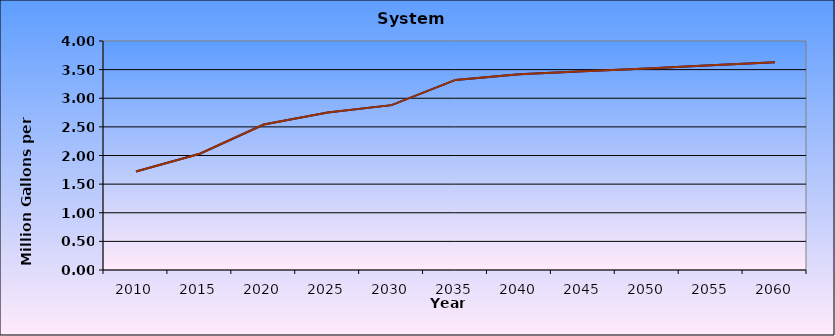
| Category | Series 0 | Series 1 |
|---|---|---|
| 2010.0 | 1.72 | 1.72 |
| 2015.0 | 2.03 | 2.03 |
| 2020.0 | 2.54 | 2.54 |
| 2025.0 | 2.75 | 2.75 |
| 2030.0 | 2.88 | 2.88 |
| 2035.0 | 3.32 | 3.32 |
| 2040.0 | 3.42 | 3.42 |
| 2045.0 | 3.47 | 3.47 |
| 2050.0 | 3.52 | 3.52 |
| 2055.0 | 3.575 | 3.575 |
| 2060.0 | 3.63 | 3.63 |